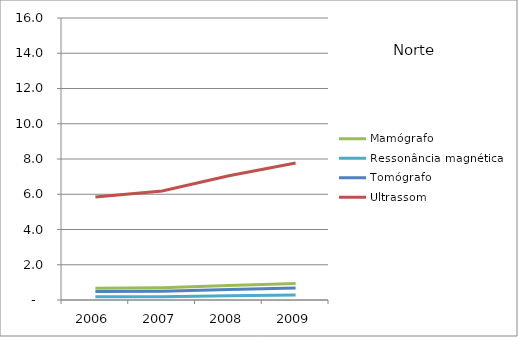
| Category | Mamógrafo | Ressonância magnética | Tomógrafo | Ultrassom |
|---|---|---|---|---|
| 2006.0 | 0.66 | 0.18 | 0.48 | 5.84 |
| 2007.0 | 0.7 | 0.18 | 0.5 | 6.19 |
| 2008.0 | 0.82 | 0.24 | 0.59 | 7.05 |
| 2009.0 | 0.94 | 0.29 | 0.68 | 7.77 |